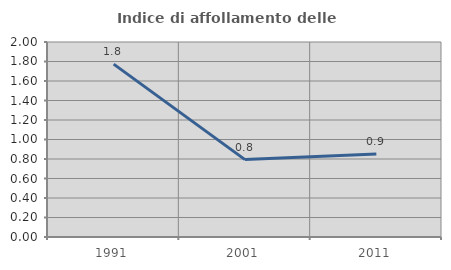
| Category | Indice di affollamento delle abitazioni  |
|---|---|
| 1991.0 | 1.773 |
| 2001.0 | 0.794 |
| 2011.0 | 0.851 |